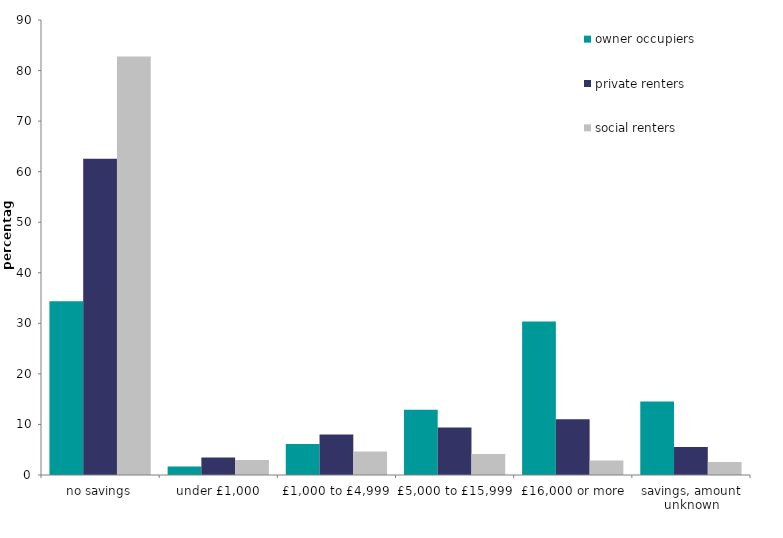
| Category | owner occupiers | private renters | social renters |
|---|---|---|---|
| no savings | 34.345 | 62.569 | 82.797 |
| under £1,000 | 1.665 | 3.445 | 2.949 |
| £1,000 to £4,999 | 6.146 | 8.013 | 4.629 |
| £5,000 to £15,999 | 12.931 | 9.393 | 4.163 |
| £16,000 or more | 30.37 | 11.029 | 2.878 |
| savings, amount unknown | 14.542 | 5.551 | 2.584 |